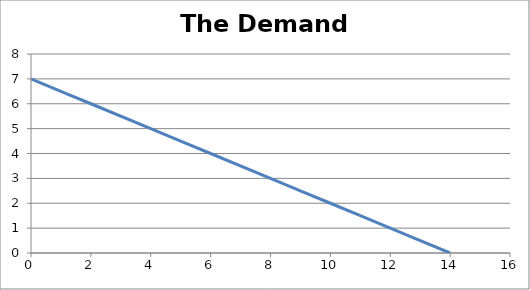
| Category | P |
|---|---|
| 14.0 | 0 |
| 12.0 | 1 |
| 10.0 | 2 |
| 8.0 | 3 |
| 6.0 | 4 |
| 4.0 | 5 |
| 2.0 | 6 |
| 0.0 | 7 |